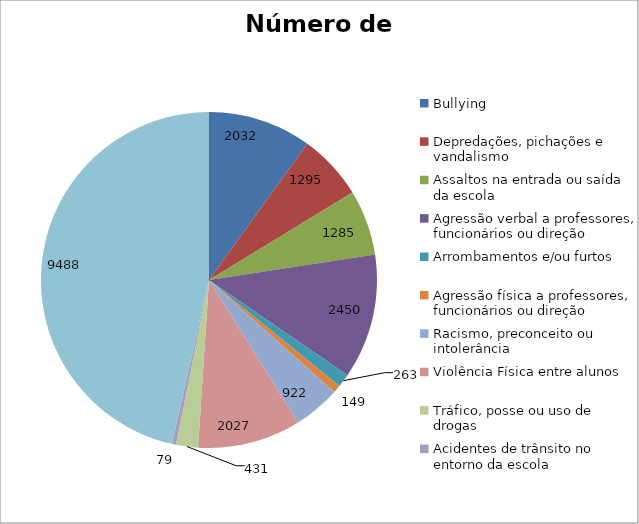
| Category | Número de Casos |
|---|---|
| Bullying | 2032 |
| Depredações, pichações e vandalismo | 1295 |
| Assaltos na entrada ou saída da escola | 1285 |
| Agressão verbal a professores, funcionários ou direção | 2450 |
| Arrombamentos e/ou furtos | 263 |
| Agressão física a professores, funcionários ou direção | 149 |
| Racismo, preconceito ou intolerância | 922 |
| Violência Física entre alunos | 2027 |
| Tráfico, posse ou uso de drogas | 431 |
| Acidentes de trânsito no entorno da escola | 79 |
| Indisciplina | 9488 |